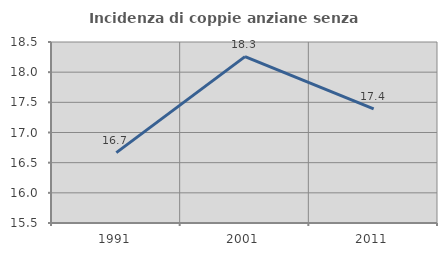
| Category | Incidenza di coppie anziane senza figli  |
|---|---|
| 1991.0 | 16.667 |
| 2001.0 | 18.257 |
| 2011.0 | 17.391 |